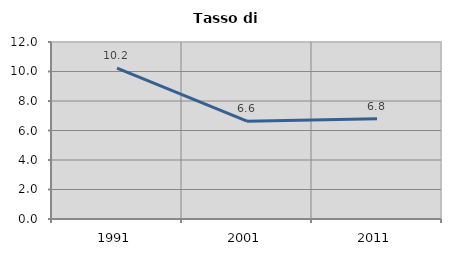
| Category | Tasso di disoccupazione   |
|---|---|
| 1991.0 | 10.223 |
| 2001.0 | 6.635 |
| 2011.0 | 6.804 |